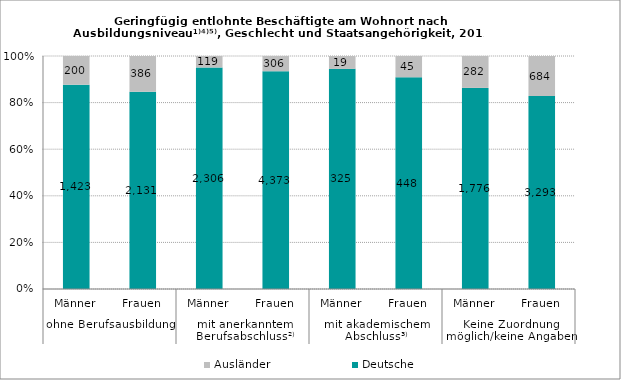
| Category | Deutsche | Ausländer |
|---|---|---|
| 0 | 1423 | 200 |
| 1 | 2131 | 386 |
| 2 | 2306 | 119 |
| 3 | 4373 | 306 |
| 4 | 325 | 19 |
| 5 | 448 | 45 |
| 6 | 1776 | 282 |
| 7 | 3293 | 684 |